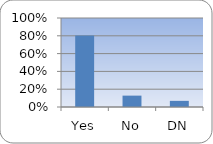
| Category | Series 0 |
|---|---|
| Yes | 0.803 |
| No | 0.128 |
| DN | 0.069 |